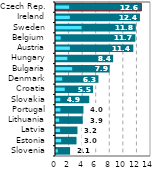
| Category |  Celkem |
|---|---|
| Slovenia | 2.073 |
| Estonia | 3.025 |
| Latvia | 3.164 |
| Lithuania | 3.938 |
| Portugal | 4.042 |
| Slovakia | 4.902 |
| Croatia | 5.451 |
| Denmark | 6.255 |
| Bulgaria | 7.903 |
| Hungary | 8.418 |
| Austria | 11.393 |
| Belgium | 11.699 |
| Sweden | 11.758 |
| Ireland | 12.374 |
| Czech Rep. | 12.577 |